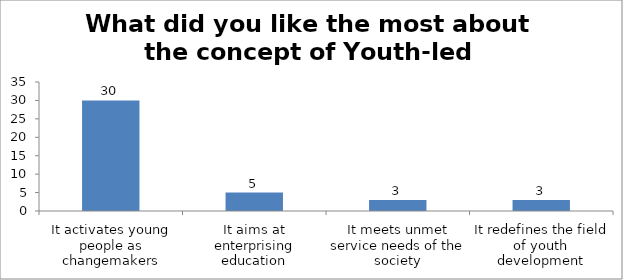
| Category | What did you like the most about the concept of Youth-led Changemaking? |
|---|---|
| It activates young people as changemakers | 30 |
| It aims at enterprising education | 5 |
| It meets unmet service needs of the society | 3 |
| It redefines the field of youth development | 3 |